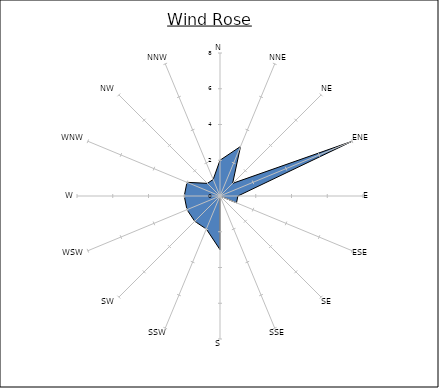
| Category | Series 0 |
|---|---|
| N | 2 |
| NNE | 3 |
| NE | 1 |
| ENE | 8 |
| E | 1 |
| ESE | 1 |
| SE | 0 |
| SSE | 0 |
| S | 3 |
| SSW | 2 |
| SW | 2 |
| WSW | 2 |
| W | 2 |
| WNW | 2 |
| NW | 1 |
| NNW | 1 |